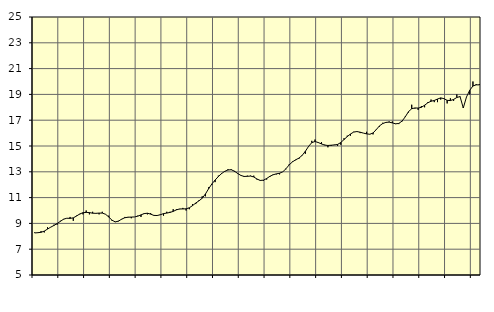
| Category | Piggar | Finansiell verksamhet, företagstjänster, SNI 64-821 |
|---|---|---|
| nan | 8.3 | 8.26 |
| 87.0 | 8.3 | 8.28 |
| 87.0 | 8.4 | 8.31 |
| 87.0 | 8.3 | 8.4 |
| nan | 8.7 | 8.56 |
| 88.0 | 8.7 | 8.71 |
| 88.0 | 8.9 | 8.84 |
| 88.0 | 8.9 | 8.99 |
| nan | 9.2 | 9.16 |
| 89.0 | 9.3 | 9.33 |
| 89.0 | 9.4 | 9.4 |
| 89.0 | 9.5 | 9.39 |
| nan | 9.2 | 9.43 |
| 90.0 | 9.6 | 9.57 |
| 90.0 | 9.7 | 9.73 |
| 90.0 | 9.7 | 9.83 |
| nan | 10 | 9.85 |
| 91.0 | 9.7 | 9.84 |
| 91.0 | 9.9 | 9.79 |
| 91.0 | 9.8 | 9.78 |
| nan | 9.7 | 9.8 |
| 92.0 | 9.9 | 9.8 |
| 92.0 | 9.7 | 9.71 |
| 92.0 | 9.6 | 9.5 |
| nan | 9.2 | 9.25 |
| 93.0 | 9.1 | 9.12 |
| 93.0 | 9.2 | 9.17 |
| 93.0 | 9.3 | 9.33 |
| nan | 9.5 | 9.44 |
| 94.0 | 9.5 | 9.48 |
| 94.0 | 9.4 | 9.49 |
| 94.0 | 9.5 | 9.5 |
| nan | 9.6 | 9.56 |
| 95.0 | 9.5 | 9.66 |
| 95.0 | 9.8 | 9.76 |
| 95.0 | 9.7 | 9.79 |
| nan | 9.8 | 9.72 |
| 96.0 | 9.6 | 9.62 |
| 96.0 | 9.6 | 9.61 |
| 96.0 | 9.7 | 9.67 |
| nan | 9.6 | 9.76 |
| 97.0 | 9.9 | 9.8 |
| 97.0 | 9.9 | 9.85 |
| 97.0 | 10.1 | 9.93 |
| nan | 10.1 | 10.05 |
| 98.0 | 10.1 | 10.12 |
| 98.0 | 10.2 | 10.12 |
| 98.0 | 10 | 10.13 |
| nan | 10.1 | 10.21 |
| 99.0 | 10.5 | 10.38 |
| 99.0 | 10.5 | 10.58 |
| 99.0 | 10.8 | 10.75 |
| nan | 11.1 | 10.95 |
| 0.0 | 11.1 | 11.28 |
| 0.0 | 11.8 | 11.69 |
| 0.0 | 12 | 12.06 |
| nan | 12.2 | 12.36 |
| 1.0 | 12.7 | 12.63 |
| 1.0 | 12.9 | 12.86 |
| 1.0 | 13 | 13.04 |
| nan | 13.2 | 13.14 |
| 2.0 | 13.2 | 13.16 |
| 2.0 | 13 | 13.05 |
| 2.0 | 12.9 | 12.87 |
| nan | 12.7 | 12.72 |
| 3.0 | 12.6 | 12.64 |
| 3.0 | 12.7 | 12.65 |
| 3.0 | 12.7 | 12.67 |
| nan | 12.7 | 12.6 |
| 4.0 | 12.4 | 12.44 |
| 4.0 | 12.3 | 12.33 |
| 4.0 | 12.3 | 12.35 |
| nan | 12.4 | 12.48 |
| 5.0 | 12.6 | 12.65 |
| 5.0 | 12.8 | 12.77 |
| 5.0 | 12.8 | 12.84 |
| nan | 12.8 | 12.89 |
| 6.0 | 13 | 13 |
| 6.0 | 13.2 | 13.24 |
| 6.0 | 13.6 | 13.54 |
| nan | 13.8 | 13.77 |
| 7.0 | 13.9 | 13.93 |
| 7.0 | 14 | 14.06 |
| 7.0 | 14.3 | 14.27 |
| nan | 14.4 | 14.59 |
| 8.0 | 15 | 14.97 |
| 8.0 | 15.4 | 15.26 |
| 8.0 | 15.5 | 15.35 |
| nan | 15.3 | 15.27 |
| 9.0 | 15.3 | 15.16 |
| 9.0 | 15.1 | 15.07 |
| 9.0 | 14.9 | 15.04 |
| nan | 15 | 15.06 |
| 10.0 | 15.1 | 15.08 |
| 10.0 | 15 | 15.12 |
| 10.0 | 15.1 | 15.27 |
| nan | 15.6 | 15.5 |
| 11.0 | 15.8 | 15.73 |
| 11.0 | 15.8 | 15.93 |
| 11.0 | 16.1 | 16.08 |
| nan | 16.1 | 16.12 |
| 12.0 | 16 | 16.07 |
| 12.0 | 16 | 16 |
| 12.0 | 16.1 | 15.94 |
| nan | 15.9 | 15.91 |
| 13.0 | 15.9 | 16.01 |
| 13.0 | 16.3 | 16.27 |
| 13.0 | 16.5 | 16.56 |
| nan | 16.8 | 16.74 |
| 14.0 | 16.8 | 16.83 |
| 14.0 | 16.9 | 16.85 |
| 14.0 | 16.9 | 16.79 |
| nan | 16.7 | 16.72 |
| 15.0 | 16.7 | 16.75 |
| 15.0 | 16.9 | 16.93 |
| 15.0 | 17.3 | 17.26 |
| nan | 17.6 | 17.66 |
| 16.0 | 18.2 | 17.89 |
| 16.0 | 17.9 | 17.95 |
| 16.0 | 17.8 | 17.94 |
| nan | 18.1 | 18 |
| 17.0 | 18 | 18.16 |
| 17.0 | 18.4 | 18.35 |
| 17.0 | 18.6 | 18.47 |
| nan | 18.4 | 18.53 |
| 18.0 | 18.4 | 18.64 |
| 18.0 | 18.6 | 18.73 |
| 18.0 | 18.7 | 18.67 |
| nan | 18.3 | 18.54 |
| 19.0 | 18.7 | 18.52 |
| 19.0 | 18.5 | 18.61 |
| 19.0 | 19 | 18.76 |
| nan | 18.8 | 18.83 |
| 20.0 | 18 | 17.95 |
| 20.0 | 18.8 | 18.8 |
| 20.0 | 19 | 19.32 |
| nan | 20 | 19.65 |
| 21.0 | 19.8 | 19.74 |
| 21.0 | 19.8 | 19.74 |